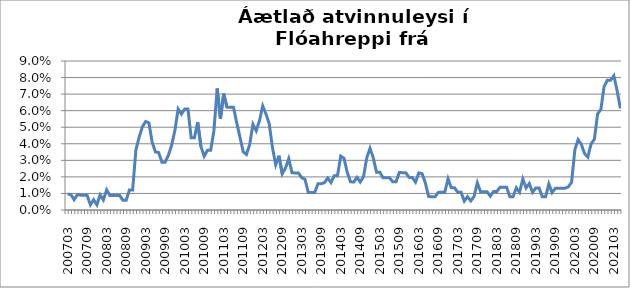
| Category | Series 0 |
|---|---|
| 200703 | 0.01 |
| 200704 | 0.009 |
| 200705 | 0.006 |
| 200706 | 0.009 |
| 200707 | 0.009 |
| 200708 | 0.009 |
| 200709 | 0.009 |
| 200710 | 0.003 |
| 200711 | 0.006 |
| 200712 | 0.003 |
| 200801 | 0.009 |
| 200802 | 0.006 |
| 200803 | 0.012 |
| 200804 | 0.009 |
| 200805 | 0.009 |
| 200806 | 0.009 |
| 200807 | 0.009 |
| 200808 | 0.006 |
| 200809 | 0.006 |
| 200810 | 0.012 |
| 200811 | 0.012 |
| 200812 | 0.036 |
| 200901 | 0.044 |
| 200902 | 0.05 |
| 200903 | 0.053 |
| 200904 | 0.053 |
| 200905 | 0.041 |
| 200906 | 0.035 |
| 200907 | 0.035 |
| 200908 | 0.029 |
| 200909 | 0.029 |
| 200910 | 0.033 |
| 200911 | 0.039 |
| 200912 | 0.048 |
| 201001 | 0.061 |
| 201002 | 0.058 |
| 201003 | 0.061 |
| 201004 | 0.061 |
| 201005 | 0.044 |
| 201006 | 0.044 |
| 201007 | 0.053 |
| 201008 | 0.038 |
| 201009 | 0.032 |
| 201010 | 0.036 |
| 201011 | 0.036 |
| 201012 | 0.048 |
| 201101 | 0.073 |
| 201102 | 0.055 |
| 201103 | 0.07 |
| 201104 | 0.062 |
| 201105 | 0.062 |
| 201106 | 0.062 |
| 201107 | 0.053 |
| 201108 | 0.044 |
| 201109 | 0.035 |
| 201110 | 0.034 |
| 201111 | 0.04 |
| 201112 | 0.052 |
| 201201 | 0.048 |
| 201202 | 0.054 |
| 201203 | 0.063 |
| 201204 | 0.058 |
| 201205 | 0.052 |
| 201206 | 0.038 |
| 201207 | 0.027 |
| 201208 | 0.033 |
| 201209 | 0.022 |
| 201210 | 0.025 |
| 201211 | 0.031 |
| 201212 | 0.023 |
| 201301 | 0.022 |
| 201302 | 0.022 |
| 201303 | 0.02 |
| 201304 | 0.019 |
| 201305 | 0.011 |
| 201306 | 0.011 |
| 201307 | 0.011 |
| 201308 | 0.016 |
| 201309 | 0.016 |
| 201310 | 0.017 |
| 201311 | 0.019 |
| 201312 | 0.017 |
| 201401 | 0.021 |
| 201402 | 0.021 |
| 201403 | 0.033 |
| 201404 | 0.031 |
| 201405 | 0.023 |
| 201406 | 0.017 |
| 201407 | 0.017 |
| 201408 | 0.02 |
| 201409 | 0.017 |
| 201410 | 0.02 |
| 201411 | 0.032 |
| 201412 | 0.037 |
| 201501 | 0.031 |
| 201502 | 0.023 |
| 201503 | 0.023 |
| 201504 | 0.019 |
| 201505 | 0.019 |
| 201506 | 0.019 |
| 201507 | 0.017 |
| 201508 | 0.017 |
| 201509 | 0.023 |
| 201510 | 0.023 |
| 201511 | 0.023 |
| 201512 | 0.02 |
| 201601 | 0.02 |
| 201602 | 0.017 |
| 201603 | 0.022 |
| 201604 | 0.022 |
| 201605 | 0.016 |
| 201606 | 0.008 |
| 201607 | 0.008 |
| 201608 | 0.008 |
| 201609 | 0.011 |
| 201610 | 0.011 |
| 201611 | 0.011 |
| 201612 | 0.019 |
| 201701 | 0.013 |
| 201702 | 0.013 |
| 201703 | 0.011 |
| 201704 | 0.011 |
| 201705 | 0.005 |
| 201706 | 0.008 |
| 201707 | 0.005 |
| 201708 | 0.008 |
| 201709 | 0.016 |
| 201710 | 0.011 |
| 201711 | 0.011 |
| 201712 | 0.011 |
| 201801 | 0.008 |
| 201802 | 0.011 |
| 201803 | 0.011 |
| 201804 | 0.014 |
| 201805 | 0.014 |
| 201806 | 0.014 |
| 201807 | 0.008 |
| 201808 | 0.008 |
| 201809 | 0.013 |
| 201810 | 0.011 |
| 201811 | 0.019 |
| 201812 | 0.013 |
| 201901 | 0.016 |
| 201902 | 0.011 |
| 201903 | 0.013 |
| 201904 | 0.013 |
| 201905 | 0.008 |
| 201906 | 0.008 |
| 201907 | 0.016 |
| 201908 | 0.01 |
| 201909 | 0.013 |
| 201910 | 0.013 |
| 201911 | 0.013 |
| 201912 | 0.013 |
| 202001 | 0.014 |
| 202002 | 0.017 |
| 202003 | 0.036 |
| 202004 | 0.042 |
| 202005 | 0.04 |
| 202006 | 0.034 |
| 202007 | 0.032 |
| 202008 | 0.04 |
| 202009 | 0.043 |
| 202010 | 0.058 |
| 202011 | 0.061 |
| 202012 | 0.075 |
| 202101 | 0.078 |
| 202102 | 0.078 |
| 202103 | 0.081 |
| 202104 | 0.072 |
| 202105 | 0.061 |